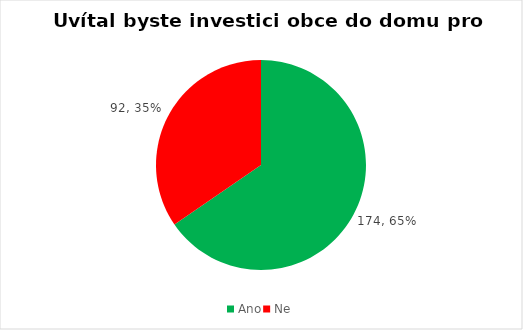
| Category | Series 0 |
|---|---|
| Ano | 174 |
| Ne | 92 |